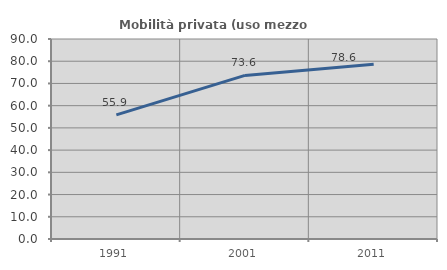
| Category | Mobilità privata (uso mezzo privato) |
|---|---|
| 1991.0 | 55.882 |
| 2001.0 | 73.626 |
| 2011.0 | 78.641 |